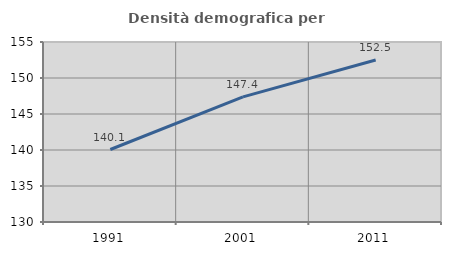
| Category | Densità demografica |
|---|---|
| 1991.0 | 140.069 |
| 2001.0 | 147.378 |
| 2011.0 | 152.507 |